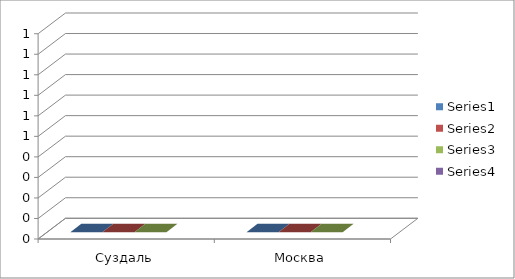
| Category | Series 0 | Series 1 | Series 2 | Series 3 |
|---|---|---|---|---|
| Суздаль | 0 | 0 | 0 |  |
| Москва | 0 | 0 | 0 |  |